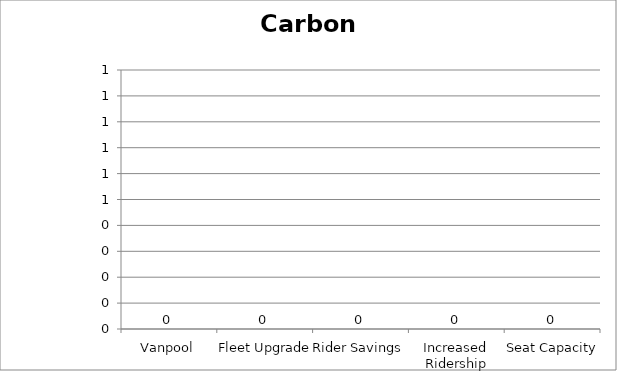
| Category | Carbon Monoxide |
|---|---|
| Vanpool | 0 |
| Fleet Upgrade | 0 |
| Rider Savings | 0 |
| Increased Ridership | 0 |
| Seat Capacity | 0 |